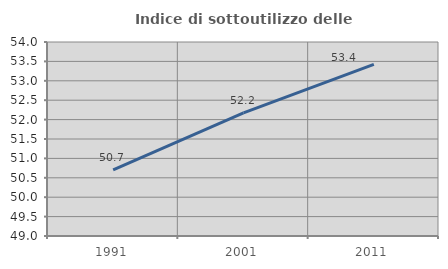
| Category | Indice di sottoutilizzo delle abitazioni  |
|---|---|
| 1991.0 | 50.704 |
| 2001.0 | 52.174 |
| 2011.0 | 53.425 |